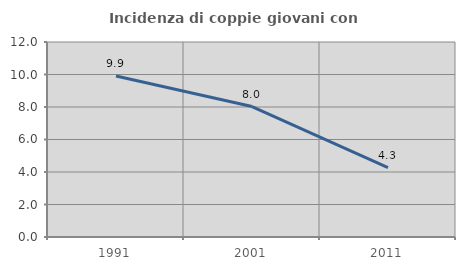
| Category | Incidenza di coppie giovani con figli |
|---|---|
| 1991.0 | 9.91 |
| 2001.0 | 8.027 |
| 2011.0 | 4.264 |